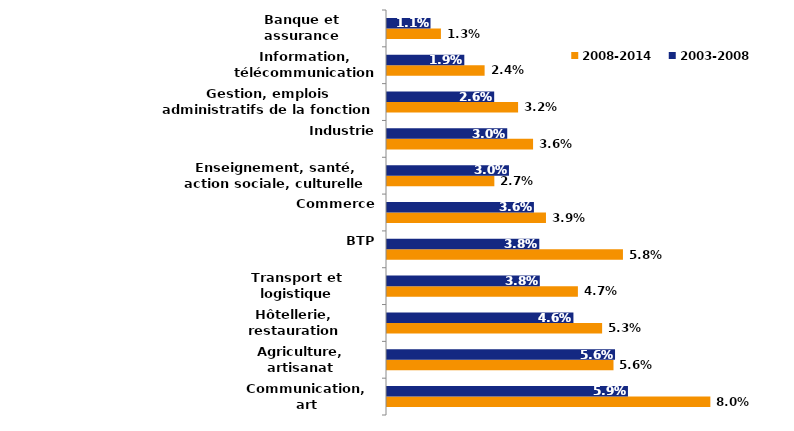
| Category | 2008-2014 | 2003-2008 |
|---|---|---|
| Communication, art | 0.08 | 0.059 |
| Agriculture, artisanat | 0.056 | 0.056 |
| Hôtellerie, restauration | 0.053 | 0.046 |
| Transport et logistique | 0.047 | 0.038 |
| BTP | 0.058 | 0.038 |
| Commerce | 0.039 | 0.036 |
| Enseignement, santé, action sociale, culturelle et sportive | 0.027 | 0.03 |
| Industrie | 0.036 | 0.03 |
| Gestion, emplois administratifs de la fonction publique | 0.032 | 0.026 |
| Information, télécommunications | 0.024 | 0.019 |
| Banque et assurance | 0.013 | 0.011 |